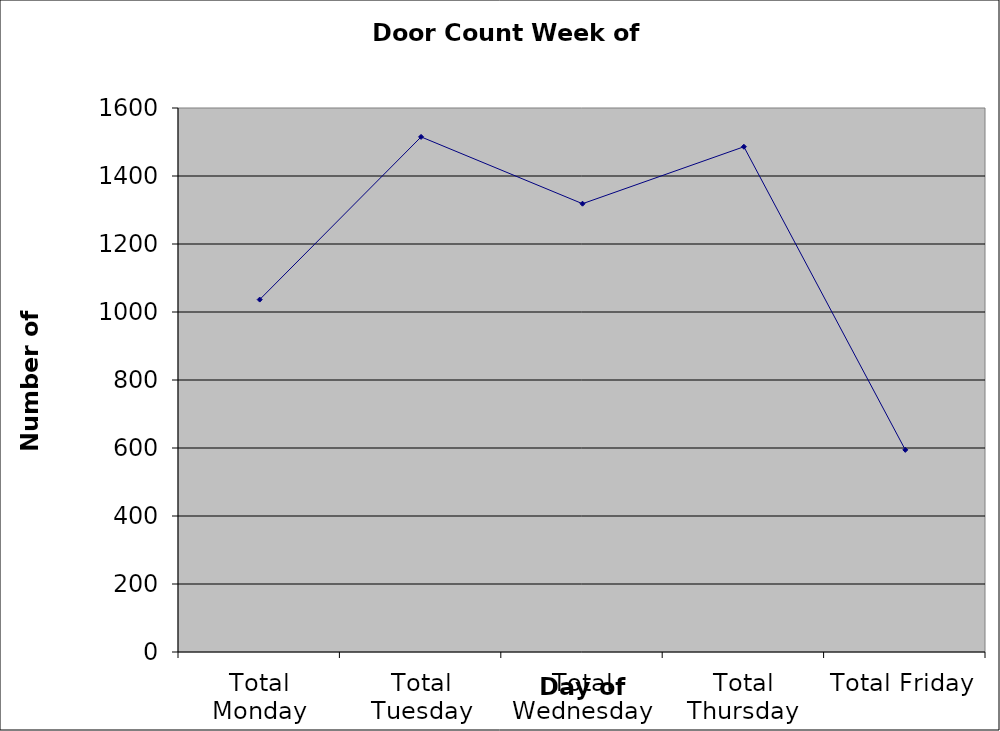
| Category | Series 0 |
|---|---|
| Total Monday | 1036.5 |
| Total Tuesday | 1515 |
| Total Wednesday | 1318.5 |
| Total Thursday | 1486 |
| Total Friday | 594.5 |